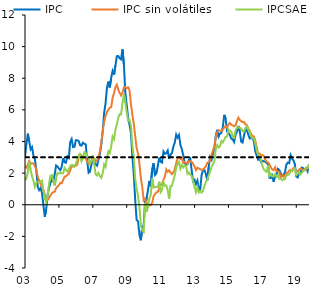
| Category | IPC | IPC sin volátiles | IPCSAE | Meta horizonte política |
|---|---|---|---|---|
| 2003-01-01 | 3.025 | 2.415 | 1.532 | 3 |
| 2003-02-01 | 3.832 | 2.346 | 1.671 | 3 |
| 2003-03-01 | 4.495 | 2.541 | 2.041 | 3 |
| 2003-04-01 | 4.001 | 2.76 | 2.694 | 3 |
| 2003-05-01 | 3.507 | 2.579 | 2.182 | 3 |
| 2003-06-01 | 3.639 | 2.63 | 1.786 | 3 |
| 2003-07-01 | 3.093 | 2.595 | 1.522 | 3 |
| 2003-08-01 | 2.869 | 2.459 | 1.135 | 3 |
| 2003-09-01 | 2.2 | 2.206 | 1.396 | 3 |
| 2003-10-01 | 1.151 | 1.783 | 1.455 | 3 |
| 2003-11-01 | 0.923 | 1.52 | 1.409 | 3 |
| 2003-12-01 | 1.045 | 1.329 | 1.482 | 3 |
| 2004-01-01 | 0.767 | 1.084 | 1.53 | 3 |
| 2004-02-01 | -0.011 | 0.948 | 0.873 | 3 |
| 2004-03-01 | -0.751 | 0.649 | 0.398 | 3 |
| 2004-04-01 | -0.296 | 0.316 | 0.155 | 3 |
| 2004-05-01 | 0.621 | 0.299 | 0.617 | 3 |
| 2004-06-01 | 1.056 | 0.41 | 1.307 | 3 |
| 2004-07-01 | 1.378 | 0.595 | 1.824 | 3 |
| 2004-08-01 | 1.596 | 0.727 | 1.874 | 3 |
| 2004-09-01 | 1.462 | 0.8 | 1.488 | 3 |
| 2004-10-01 | 1.913 | 0.823 | 1.214 | 3 |
| 2004-11-01 | 2.483 | 1.044 | 1.661 | 3 |
| 2004-12-01 | 2.421 | 1.155 | 2.009 | 3 |
| 2005-01-01 | 2.288 | 1.236 | 1.961 | 3 |
| 2005-02-01 | 2.182 | 1.386 | 2.035 | 3 |
| 2005-03-01 | 2.404 | 1.36 | 1.995 | 3 |
| 2005-04-01 | 2.95 | 1.558 | 1.994 | 3 |
| 2005-05-01 | 2.684 | 1.781 | 2.333 | 3 |
| 2005-06-01 | 2.66 | 1.795 | 2.193 | 3 |
| 2005-07-01 | 3.055 | 1.887 | 2.099 | 3 |
| 2005-08-01 | 2.963 | 1.956 | 2.245 | 3 |
| 2005-09-01 | 3.962 | 2.175 | 2.443 | 3 |
| 2005-10-01 | 4.153 | 2.416 | 2.511 | 3 |
| 2005-11-01 | 3.646 | 2.411 | 2.509 | 3 |
| 2005-12-01 | 3.667 | 2.466 | 2.405 | 3 |
| 2006-01-01 | 4.081 | 2.454 | 2.59 | 3 |
| 2006-02-01 | 4.078 | 2.548 | 2.874 | 3 |
| 2006-03-01 | 4.027 | 2.964 | 3.14 | 3 |
| 2006-04-01 | 3.768 | 3.19 | 3.198 | 3 |
| 2006-05-01 | 3.74 | 3.119 | 2.749 | 3 |
| 2006-06-01 | 3.925 | 3.026 | 2.929 | 3 |
| 2006-07-01 | 3.855 | 3.014 | 3.313 | 3 |
| 2006-08-01 | 3.814 | 2.92 | 3.276 | 3 |
| 2006-09-01 | 2.778 | 2.73 | 3.085 | 3 |
| 2006-10-01 | 2.025 | 2.61 | 3.002 | 3 |
| 2006-11-01 | 2.092 | 2.708 | 2.584 | 3 |
| 2006-12-01 | 2.556 | 2.789 | 2.735 | 3 |
| 2007-01-01 | 2.788 | 2.977 | 3.142 | 3 |
| 2007-02-01 | 2.704 | 2.948 | 2.544 | 3 |
| 2007-03-01 | 2.543 | 2.77 | 1.928 | 3 |
| 2007-04-01 | 2.471 | 2.773 | 1.847 | 3 |
| 2007-05-01 | 2.859 | 3.033 | 2.008 | 3 |
| 2007-06-01 | 3.214 | 3.368 | 1.809 | 3 |
| 2007-07-01 | 3.803 | 3.934 | 1.7 | 3 |
| 2007-08-01 | 4.646 | 4.639 | 1.993 | 3 |
| 2007-09-01 | 5.798 | 5.238 | 2.549 | 3 |
| 2007-10-01 | 6.398 | 5.609 | 2.395 | 3 |
| 2007-11-01 | 7.393 | 5.857 | 2.953 | 3 |
| 2007-12-01 | 7.784 | 6.019 | 3.379 | 3 |
| 2008-01-01 | 7.42 | 6.14 | 3.269 | 3 |
| 2008-02-01 | 8.033 | 6.166 | 3.689 | 3 |
| 2008-03-01 | 8.461 | 6.762 | 4.312 | 3 |
| 2008-04-01 | 8.227 | 7.057 | 4.148 | 3 |
| 2008-05-01 | 8.801 | 7.43 | 4.726 | 3 |
| 2008-06-01 | 9.394 | 7.596 | 5.081 | 3 |
| 2008-07-01 | 9.405 | 7.293 | 5.5 | 3 |
| 2008-08-01 | 9.259 | 7.069 | 5.726 | 3 |
| 2008-09-01 | 9.197 | 6.915 | 5.708 | 3 |
| 2008-10-01 | 9.828 | 7.079 | 6.442 | 3 |
| 2008-11-01 | 8.867 | 7.434 | 6.996 | 3 |
| 2008-12-01 | 7.092 | 7.442 | 6.48 | 3 |
| 2009-01-01 | 6.306 | 7.372 | 5.829 | 3 |
| 2009-02-01 | 5.503 | 7.425 | 5.3 | 3 |
| 2009-03-01 | 5.05 | 7.242 | 5.346 | 3 |
| 2009-04-01 | 4.51 | 6.352 | 5 | 3 |
| 2009-05-01 | 3.058 | 5.678 | 3.725 | 3 |
| 2009-06-01 | 1.901 | 5.122 | 3.051 | 3 |
| 2009-07-01 | 0.316 | 4.331 | 1.642 | 3 |
| 2009-08-01 | -0.969 | 3.601 | 1.025 | 3 |
| 2009-09-01 | -1.047 | 3.241 | 0.56 | 3 |
| 2009-10-01 | -1.917 | 2.606 | -0.163 | 3 |
| 2009-11-01 | -2.244 | 1.674 | -1.282 | 3 |
| 2009-12-01 | -1.38 | 1.128 | -1.627 | 3 |
| 2010-01-01 | -1.321 | 0.278 | -1.725 | 3 |
| 2010-02-01 | 0.259 | 0.39 | 0.119 | 3 |
| 2010-03-01 | 0.303 | -0.005 | -0.442 | 3 |
| 2010-04-01 | 0.923 | 0.122 | -0.132 | 3 |
| 2010-05-01 | 1.503 | -0.034 | 0.383 | 3 |
| 2010-06-01 | 1.164 | -0.023 | 0.61 | 3 |
| 2010-07-01 | 2.252 | 0.12 | 1.663 | 3 |
| 2010-08-01 | 2.624 | 0.533 | 1.087 | 3 |
| 2010-09-01 | 1.876 | 0.671 | 1.139 | 3 |
| 2010-10-01 | 1.984 | 0.78 | 1.113 | 3 |
| 2010-11-01 | 2.461 | 0.817 | 1.136 | 3 |
| 2010-12-01 | 2.973 | 1.048 | 1.459 | 3 |
| 2011-01-01 | 2.719 | 1.25 | 0.799 | 3 |
| 2011-02-01 | 2.667 | 1.311 | 0.944 | 3 |
| 2011-03-01 | 3.365 | 1.582 | 1.441 | 3 |
| 2011-04-01 | 3.218 | 1.775 | 1.21 | 3 |
| 2011-05-01 | 3.259 | 2.232 | 1.218 | 3 |
| 2011-06-01 | 3.434 | 2.084 | 0.928 | 3 |
| 2011-07-01 | 2.904 | 2.178 | 0.387 | 3 |
| 2011-08-01 | 3.172 | 2.034 | 1.174 | 3 |
| 2011-09-01 | 3.272 | 1.936 | 1.198 | 3 |
| 2011-10-01 | 3.672 | 2.047 | 1.537 | 3 |
| 2011-11-01 | 3.928 | 2.252 | 1.853 | 3 |
| 2011-12-01 | 4.438 | 2.617 | 2.364 | 3 |
| 2012-01-01 | 4.247 | 2.955 | 2.584 | 3 |
| 2012-02-01 | 4.412 | 3.003 | 2.709 | 3 |
| 2012-03-01 | 3.789 | 2.9 | 2.28 | 3 |
| 2012-04-01 | 3.511 | 2.952 | 2.491 | 3 |
| 2012-05-01 | 3.131 | 2.637 | 2.36 | 3 |
| 2012-06-01 | 2.651 | 2.703 | 2.49 | 3 |
| 2012-07-01 | 2.507 | 2.644 | 2.467 | 3 |
| 2012-08-01 | 2.568 | 2.594 | 1.953 | 3 |
| 2012-09-01 | 2.845 | 2.755 | 2.04 | 3 |
| 2012-10-01 | 2.92 | 2.755 | 1.887 | 3 |
| 2012-11-01 | 2.132 | 2.708 | 1.814 | 3 |
| 2012-12-01 | 1.487 | 2.589 | 1.487 | 3 |
| 2013-01-01 | 1.578 | 2.406 | 1.12 | 3 |
| 2013-02-01 | 1.304 | 2.189 | 0.791 | 3 |
| 2013-03-01 | 1.527 | 2.344 | 1.116 | 3 |
| 2013-04-01 | 0.984 | 2.292 | 0.784 | 3 |
| 2013-05-01 | 0.945 | 2.246 | 0.865 | 3 |
| 2013-06-01 | 1.893 | 2.206 | 0.775 | 3 |
| 2013-07-01 | 2.172 | 2.214 | 0.878 | 3 |
| 2013-08-01 | 2.192 | 2.33 | 1.183 | 3 |
| 2013-09-01 | 1.957 | 2.432 | 1.443 | 3 |
| 2013-10-01 | 1.535 | 2.658 | 1.572 | 3 |
| 2013-11-01 | 2.374 | 2.685 | 1.85 | 3 |
| 2013-12-01 | 3.014 | 2.767 | 2.111 | 3 |
| 2014-01-01 | 2.839 | 3.163 | 2.393 | 3 |
| 2014-02-01 | 3.217 | 3.418 | 2.545 | 3 |
| 2014-03-01 | 3.505 | 3.693 | 2.741 | 3 |
| 2014-04-01 | 4.332 | 4.252 | 3.521 | 3 |
| 2014-05-01 | 4.739 | 4.576 | 3.78 | 3 |
| 2014-06-01 | 4.315 | 4.705 | 3.621 | 3 |
| 2014-07-01 | 4.501 | 4.68 | 3.693 | 3 |
| 2014-08-01 | 4.543 | 4.672 | 4.03 | 3 |
| 2014-09-01 | 4.906 | 4.738 | 3.944 | 3 |
| 2014-10-01 | 5.683 | 4.907 | 4.112 | 3 |
| 2014-11-01 | 5.452 | 4.985 | 4.299 | 3 |
| 2014-12-01 | 4.646 | 4.867 | 4.314 | 3 |
| 2015-01-01 | 4.54 | 5.064 | 4.765 | 3 |
| 2015-02-01 | 4.4 | 5.172 | 4.678 | 3 |
| 2015-03-01 | 4.184 | 5.06 | 4.633 | 3 |
| 2015-04-01 | 4.136 | 5.014 | 4.289 | 3 |
| 2015-05-01 | 3.969 | 4.963 | 4.236 | 3 |
| 2015-06-01 | 4.419 | 5.027 | 4.692 | 3 |
| 2015-07-01 | 4.617 | 5.289 | 4.877 | 3 |
| 2015-08-01 | 4.983 | 5.509 | 4.903 | 3 |
| 2015-09-01 | 4.645 | 5.364 | 4.852 | 3 |
| 2015-10-01 | 3.989 | 5.289 | 4.827 | 3 |
| 2015-11-01 | 3.937 | 5.222 | 4.658 | 3 |
| 2015-12-01 | 4.379 | 5.238 | 4.656 | 3 |
| 2016-01-01 | 4.789 | 5.081 | 4.816 | 3 |
| 2016-02-01 | 4.712 | 5.047 | 4.978 | 3 |
| 2016-03-01 | 4.452 | 4.826 | 4.761 | 3 |
| 2016-04-01 | 4.194 | 4.68 | 4.574 | 3 |
| 2016-05-01 | 4.243 | 4.474 | 4.328 | 3 |
| 2016-06-01 | 4.207 | 4.346 | 4.219 | 3 |
| 2016-07-01 | 4.02 | 4.324 | 4.179 | 3 |
| 2016-08-01 | 3.372 | 4.051 | 3.88 | 3 |
| 2016-09-01 | 3.096 | 3.624 | 3.415 | 3 |
| 2016-10-01 | 2.847 | 3.216 | 3.155 | 3 |
| 2016-11-01 | 2.929 | 3.242 | 3.003 | 3 |
| 2016-12-01 | 2.709 | 3.094 | 2.82 | 3 |
| 2017-01-01 | 2.78 | 3.154 | 2.48 | 3 |
| 2017-02-01 | 2.74 | 3.087 | 2.234 | 3 |
| 2017-03-01 | 2.743 | 2.85 | 2.15 | 3 |
| 2017-04-01 | 2.654 | 2.725 | 2.082 | 3 |
| 2017-05-01 | 2.555 | 2.674 | 2.511 | 3 |
| 2017-06-01 | 1.697 | 2.559 | 1.811 | 3 |
| 2017-07-01 | 1.697 | 2.354 | 1.967 | 3 |
| 2017-08-01 | 1.852 | 2.229 | 1.802 | 3 |
| 2017-09-01 | 1.451 | 2.186 | 1.781 | 3 |
| 2017-10-01 | 1.878 | 2.372 | 1.932 | 3 |
| 2017-11-01 | 1.91 | 2.115 | 1.776 | 3 |
| 2017-12-01 | 2.27 | 2.111 | 1.883 | 3 |
| 2018-01-01 | 2.189 | 2.058 | 1.643 | 3 |
| 2018-02-01 | 1.99 | 1.744 | 1.639 | 3 |
| 2018-03-01 | 1.81 | 1.848 | 1.553 | 3 |
| 2018-04-01 | 1.888 | 1.77 | 1.623 | 3 |
| 2018-05-01 | 2.043 | 1.88 | 1.616 | 3 |
| 2018-06-01 | 2.548 | 1.984 | 1.864 | 3 |
| 2018-07-01 | 2.664 | 2.037 | 1.876 | 3 |
| 2018-08-01 | 2.633 | 2.165 | 1.934 | 3 |
| 2018-09-01 | 3.138 | 2.201 | 2.138 | 3 |
| 2018-10-01 | 2.912 | 2.131 | 2.138 | 3 |
| 2018-11-01 | 2.819 | 2.322 | 2.232 | 3 |
| 2018-12-01 | 2.563 | 2.27 | 2.305 | 3 |
| 2019-01-01 | 1.786 | 2.088 | 1.88 | 3 |
| 2019-02-01 | 1.727 | 2.121 | 1.954 | 3 |
| 2019-03-01 | 2.005 | 2.213 | 2.046 | 3 |
| 2019-04-01 | 1.997 | 2.297 | 1.919 | 3 |
| 2019-05-01 | 2.349 | 2.241 | 2.033 | 3 |
| 2019-06-01 | 2.305 | 2.186 | 2.142 | 3 |
| 2019-07-01 | 2.202 | 2.218 | 2.219 | 3 |
| 2019-08-01 | 2.307 | 2.214 | 2.353 | 3 |
| 2019-09-01 | 2.113 | 2.316 | 2.346 | 3 |
| 2019-10-01 | 2.535 | 2.454 | 2.572 | 3 |